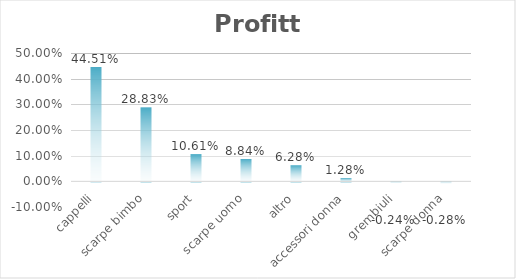
| Category | Profitto |
|---|---|
| cappelli | 0.445 |
| scarpe bimbo | 0.288 |
| sport | 0.106 |
| scarpe uomo | 0.088 |
| altro | 0.063 |
| accessori donna | 0.013 |
| grembiuli | -0.002 |
| scarpe donna | -0.003 |